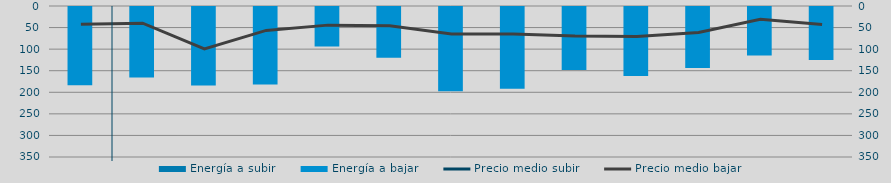
| Category | Energía a subir | Energía a bajar |
|---|---|---|
| D |  | 183.605 |
| E |  | 165.84 |
| F |  | 184.155 |
| M |  | 182.05 |
| A |  | 93.896 |
| M |  | 120.063 |
| J |  | 197.687 |
| J |  | 191.747 |
| A |  | 148.51 |
| S |  | 162.496 |
| O |  | 143.824 |
| N |  | 114.874 |
| D |  | 125.279 |